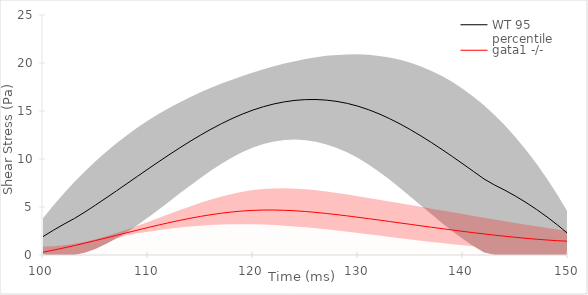
| Category | WT 95 percentile | gata1 -/- |
|---|---|---|
| 100.0 | 1.92 | 0.295 |
| 101.0 | 2.589 | 0.509 |
| 102.0 | 3.218 | 0.74 |
| 103.0 | 3.809 | 0.985 |
| 104.0 | 4.484 | 1.241 |
| 105.0 | 5.2 | 1.505 |
| 106.0 | 5.935 | 1.776 |
| 107.0 | 6.684 | 2.049 |
| 108.0 | 7.441 | 2.322 |
| 109.0 | 8.199 | 2.594 |
| 110.0 | 8.955 | 2.86 |
| 111.0 | 9.702 | 3.119 |
| 112.0 | 10.434 | 3.367 |
| 113.0 | 11.146 | 3.601 |
| 114.0 | 11.832 | 3.82 |
| 115.0 | 12.487 | 4.021 |
| 116.0 | 13.106 | 4.2 |
| 117.0 | 13.682 | 4.355 |
| 118.0 | 14.21 | 4.484 |
| 119.0 | 14.685 | 4.583 |
| 120.0 | 15.1 | 4.65 |
| 121.0 | 15.451 | 4.683 |
| 122.0 | 15.737 | 4.685 |
| 123.0 | 15.955 | 4.658 |
| 124.0 | 16.105 | 4.605 |
| 125.0 | 16.186 | 4.53 |
| 126.0 | 16.195 | 4.436 |
| 127.0 | 16.133 | 4.326 |
| 128.0 | 15.997 | 4.203 |
| 129.0 | 15.786 | 4.07 |
| 130.0 | 15.5 | 3.93 |
| 131.0 | 15.138 | 3.786 |
| 132.0 | 14.705 | 3.639 |
| 133.0 | 14.209 | 3.491 |
| 134.0 | 13.654 | 3.341 |
| 135.0 | 13.049 | 3.19 |
| 136.0 | 12.399 | 3.04 |
| 137.0 | 11.71 | 2.891 |
| 138.0 | 10.99 | 2.745 |
| 139.0 | 10.244 | 2.6 |
| 140.0 | 9.48 | 2.46 |
| 141.0 | 8.703 | 2.324 |
| 142.0 | 7.92 | 2.193 |
| 143.0 | 7.294 | 2.068 |
| 144.0 | 6.741 | 1.95 |
| 145.0 | 6.133 | 1.84 |
| 146.0 | 5.47 | 1.738 |
| 147.0 | 4.749 | 1.645 |
| 148.0 | 3.968 | 1.562 |
| 149.0 | 3.126 | 1.49 |
| 150.0 | 2.22 | 1.43 |